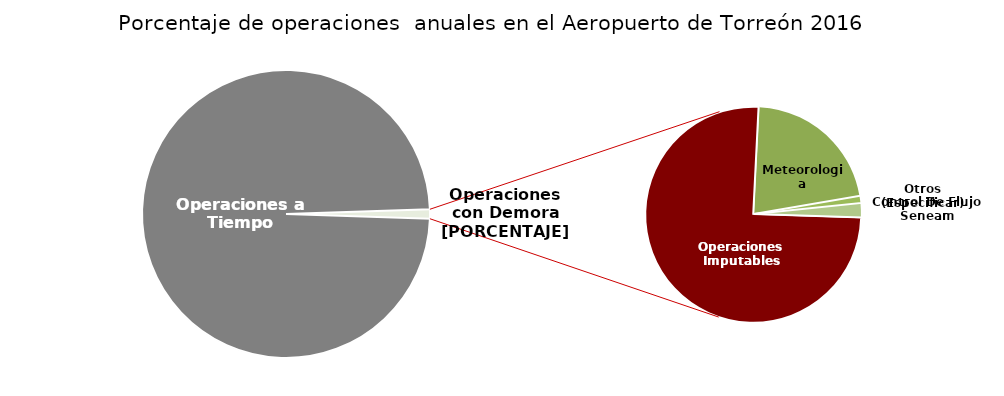
| Category | Series 0 |
|---|---|
| Operaciones a Tiempo | 8787 |
| Operaciones Imputables | 70 |
| Meteorologia | 20 |
| Otros (Especificar) | 1 |
| Control De Flujo Seneam | 2 |